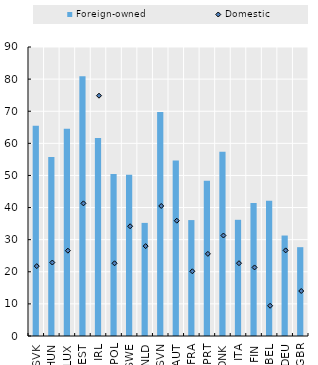
| Category | Foreign-owned |
|---|---|
| SVK | 65.453 |
| HUN | 55.721 |
| LUX | 64.572 |
| EST | 80.873 |
| IRL | 61.651 |
| POL | 50.45 |
| SWE | 50.232 |
| NLD | 35.224 |
| SVN | 69.765 |
| AUT | 54.667 |
| FRA | 36.101 |
| PRT | 48.363 |
| DNK | 57.392 |
| ITA | 36.187 |
| FIN | 41.395 |
| BEL | 42.111 |
| DEU | 31.289 |
| GBR | 27.661 |